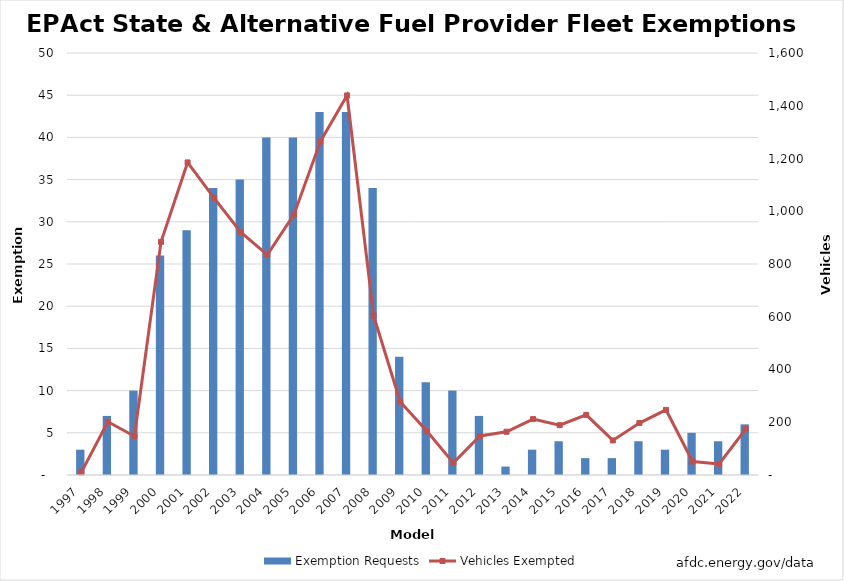
| Category | Exemption Requests |
|---|---|
| 1997.0 | 3 |
| 1998.0 | 7 |
| 1999.0 | 10 |
| 2000.0 | 26 |
| 2001.0 | 29 |
| 2002.0 | 34 |
| 2003.0 | 35 |
| 2004.0 | 40 |
| 2005.0 | 40 |
| 2006.0 | 43 |
| 2007.0 | 43 |
| 2008.0 | 34 |
| 2009.0 | 14 |
| 2010.0 | 11 |
| 2011.0 | 10 |
| 2012.0 | 7 |
| 2013.0 | 1 |
| 2014.0 | 3 |
| 2015.0 | 4 |
| 2016.0 | 2 |
| 2017.0 | 2 |
| 2018.0 | 4 |
| 2019.0 | 3 |
| 2020.0 | 5 |
| 2021.0 | 4 |
| 2022.0 | 6 |